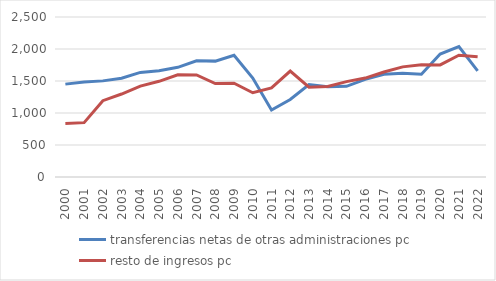
| Category | transferencias netas de otras administraciones pc | resto de ingresos pc |
|---|---|---|
| 2000.0 | 1451.29 | 836.066 |
| 2001.0 | 1483.255 | 849.285 |
| 2002.0 | 1501.927 | 1192.115 |
| 2003.0 | 1542.263 | 1296.42 |
| 2004.0 | 1634.613 | 1419.645 |
| 2005.0 | 1659.301 | 1495.109 |
| 2006.0 | 1713.923 | 1596.029 |
| 2007.0 | 1814.765 | 1594.665 |
| 2008.0 | 1810.589 | 1459.956 |
| 2009.0 | 1902.635 | 1465.315 |
| 2010.0 | 1546.951 | 1316.956 |
| 2011.0 | 1046.819 | 1392.187 |
| 2012.0 | 1211.442 | 1655.95 |
| 2013.0 | 1443.585 | 1403.702 |
| 2014.0 | 1411.785 | 1414.784 |
| 2015.0 | 1416.159 | 1490.038 |
| 2016.0 | 1525.92 | 1545.775 |
| 2017.0 | 1605.333 | 1641.003 |
| 2018.0 | 1619.963 | 1720.678 |
| 2019.0 | 1606.974 | 1754.559 |
| 2020.0 | 1920.733 | 1751.863 |
| 2021.0 | 2037.682 | 1903.233 |
| 2022.0 | 1658.384 | 1878.38 |